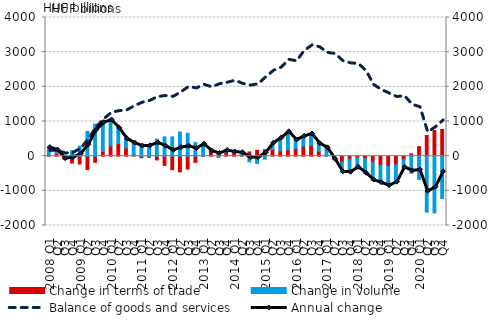
| Category | Change in terms of trade | Change in volume |
|---|---|---|
| 2008 Q1 | 17.715 | 228.858 |
| Q2 | 78.837 | 99.435 |
| Q3 | -83.133 | 10.01 |
| Q4 | -198.379 | 157.11 |
| 2009 Q1 | -226.52 | 289.366 |
| Q2 | -385.792 | 716.289 |
| Q3 | -177.271 | 924.361 |
| Q4 | 138.261 | 831.39 |
| 2010 Q1 | 293.094 | 748.867 |
| Q2 | 361.008 | 445.901 |
| Q3 | 237.758 | 263.364 |
| Q4 | 30.371 | 347.354 |
| 2011 Q1 | -43.551 | 332.719 |
| Q2 | -32.161 | 330.977 |
| Q3 | -107.92 | 491.3 |
| Q4 | -265.492 | 556.713 |
| 2012 Q1 | -389.725 | 556.506 |
| Q2 | -451.99 | 696.56 |
| Q3 | -369.981 | 659.005 |
| Q4 | -178.053 | 396.694 |
| 2013 Q1 | -11.397 | 358.094 |
| Q2 | 123.099 | 21.412 |
| Q3 | 113.669 | -34.302 |
| Q4 | 119.202 | 44.423 |
| 2014 Q1 | 82.452 | 36.966 |
| Q2 | 35.068 | 62.922 |
| Q3 | 122.918 | -164.329 |
| Q4 | 168.094 | -211.056 |
| 2015 Q1 | 184.356 | -87.151 |
| Q2 | 187.983 | 189.92 |
| Q3 | 145.078 | 375.864 |
| Q4 | 180.904 | 522.743 |
| 2016 Q1 | 216.596 | 247.523 |
| Q2 | 285.796 | 288.25 |
| Q3 | 307.369 | 332.29 |
| Q4 | 136.451 | 225.289 |
| 2017 Q1 | 6.094 | 235.267 |
| Q2 | -102.9 | 11.935 |
| Q3 | -173.212 | -280.562 |
| Q4 | -84.241 | -378.308 |
| 2018 Q1 | -37.002 | -283.107 |
| Q2 | -74.46 | -414.997 |
| Q3 | -164.049 | -525.001 |
| Q4 | -258.316 | -510.831 |
| 2019 Q1 | -292.476 | -558.539 |
| Q2 | -251.556 | -499.06 |
| Q3 | -91.069 | -232.396 |
| Q4 | 66.601 | -493.333 |
| 2020 Q1 | 274.891 | -672.942 |
| Q2 | 595.746 | -1615.121 |
| Q3 | 739.255 | -1635.079 |
| Q4 | 769.032 | -1221.52 |